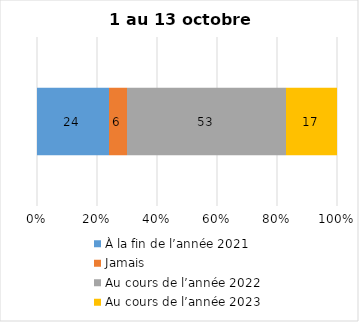
| Category | À la fin de l’année 2021 | Jamais | Au cours de l’année 2022 | Au cours de l’année 2023 |
|---|---|---|---|---|
| 0 | 24 | 6 | 53 | 17 |